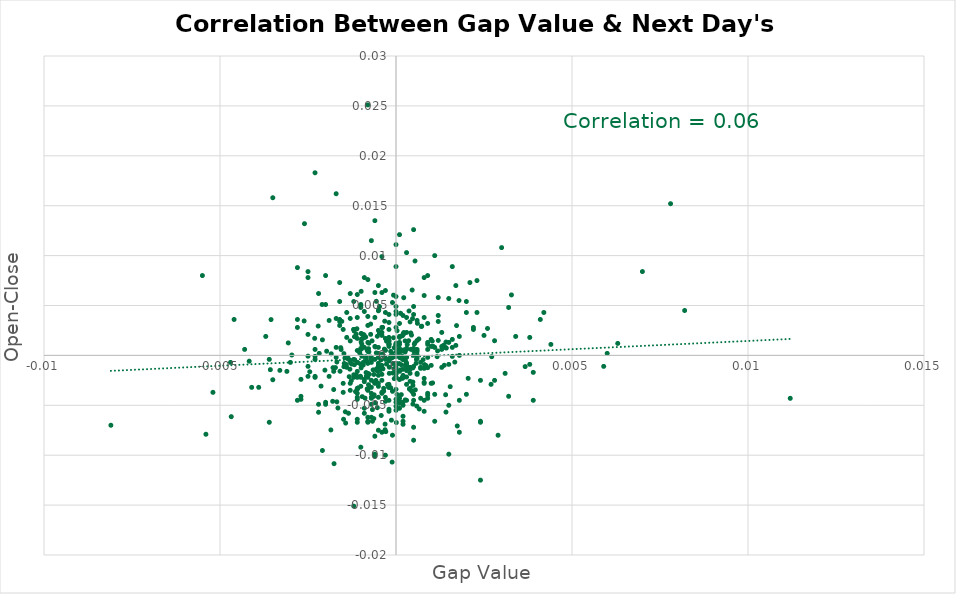
| Category | Series 0 |
|---|---|
| -0.000929999999999986 | -0.001 |
| -0.000110000000000054 | 0 |
| 0.000290000000000012 | -0.001 |
| 0.000439999999999995 | 0.002 |
| -0.00145000000000006 | 0 |
| -0.00143000000000004 | -0.007 |
| 0.000209999999999932 | 0.002 |
| -0.000769999999999937 | 0.001 |
| -0.00148000000000003 | -0.001 |
| 0.0 | -0.002 |
| 0.000219999999999998 | 0.006 |
| -0.00102000000000002 | 0.001 |
| -0.000360000000000027 | 0 |
| 0.000720000000000053 | 0.003 |
| 0.000589999999999979 | -0.005 |
| 0.000260000000000038 | -0.001 |
| -8.99999999999234e-05 | -0.002 |
| 0.000900000000000011 | -0.001 |
| 0.00141000000000002 | -0.004 |
| -0.00118000000000007 | 0.002 |
| 0.000219999999999998 | 0.002 |
| 0.000149999999999983 | -0.004 |
| -0.000580000000000024 | -0.005 |
| -0.00165000000000004 | -0.005 |
| -0.000700000000000033 | 0 |
| -0.000630000000000019 | -0.004 |
| -0.000929999999999986 | -0.001 |
| -0.00202000000000002 | -0.001 |
| 0.000170000000000003 | -0.002 |
| 0.000369999999999981 | 0.004 |
| 0.000380000000000047 | -0.003 |
| -0.000400000000000067 | -0.004 |
| -0.00132999999999994 | -0.002 |
| -0.00177000000000004 | -0.003 |
| -0.00156 | 0.001 |
| -0.000900000000000011 | -0.003 |
| 0.000730000000000008 | 0.003 |
| -0.000989999999999935 | 0.006 |
| 0.000360000000000027 | 0.001 |
| -0.000149999999999983 | 0 |
| -0.00306000000000006 | 0.001 |
| 0.00102999999999997 | 0.001 |
| -0.000209999999999932 | 0 |
| -0.000189999999999912 | 0.001 |
| -0.000390000000000001 | 0 |
| -0.000669999999999948 | -0.007 |
| 0.00153999999999998 | -0.003 |
| -0.000780000000000002 | -0.003 |
| -0.000269999999999992 | 0.001 |
| -0.000199999999999978 | -0.001 |
| -0.00197000000000002 | 0 |
| -8.99999999999234e-05 | -0.001 |
| -0.000419999999999975 | -0.001 |
| 0.000539999999999984 | 0.009 |
| -0.000879999999999991 | -0.004 |
| -0.000470000000000081 | 0.002 |
| -0.00109000000000003 | -0.001 |
| -0.00148000000000003 | 0 |
| -0.000190000000000023 | -0.002 |
| 0.000519999999999964 | 0.001 |
| -0.000209999999999932 | 0.001 |
| -0.00143999999999999 | -0.006 |
| -0.000609999999999999 | -0.003 |
| -0.000380000000000047 | 0.003 |
| -0.00114999999999998 | -0.004 |
| -0.00177000000000004 | -0.002 |
| -0.00209000000000003 | -0.01 |
| -0.00107999999999997 | -0.003 |
| -0.000419999999999975 | -0.006 |
| -0.00175999999999998 | -0.011 |
| -0.000499999999999944 | -0.001 |
| -0.000110000000000054 | -0.011 |
| -6.99999999999034e-05 | 0.006 |
| -0.000969999999999915 | 0 |
| -0.00168000000000001 | -0.005 |
| 0.000580000000000024 | 0 |
| 0.000400000000000067 | -0.001 |
| 0.00141999999999997 | -0.006 |
| -0.00129999999999996 | 0.001 |
| -0.00244999999999995 | -0.002 |
| 0.00327999999999995 | 0.006 |
| -0.00357000000000007 | -0.001 |
| -0.00468000000000001 | -0.006 |
| -0.00350000000000005 | -0.002 |
| 0.00109999999999999 | 0.001 |
| 0.000180000000000069 | 0.002 |
| 0.000499999999999944 | 0 |
| -0.00261 | 0.003 |
| -7.00000000000145e-05 | 0 |
| 0.000219999999999998 | 0.001 |
| -0.00055000000000005 | -0.001 |
| -0.000820000000000042 | -0.003 |
| -0.000620000000000064 | -0.004 |
| 0.00118000000000007 | 0 |
| -0.00097999999999998 | 0.001 |
| 0.00174000000000007 | -0.007 |
| 0.000569999999999959 | -0.001 |
| 9.99999999995449e-06 | 0 |
| 0.000480000000000036 | -0.003 |
| 0.000609999999999999 | 0.003 |
| 0.000260000000000038 | 0 |
| -0.000569999999999959 | -0.003 |
| -0.000720000000000053 | 0.003 |
| -0.00097999999999998 | 0.002 |
| -0.00095999999999996 | 0.002 |
| 0.000480000000000036 | -0.003 |
| -0.000909999999999966 | 0.002 |
| -0.00131000000000003 | -0.001 |
| -0.00117999999999995 | -0.001 |
| -0.00126000000000003 | -0.001 |
| -7.00000000000145e-05 | 0.002 |
| 0.000199999999999978 | 0.002 |
| -0.00141000000000002 | -0.001 |
| -0.000320000000000098 | 0 |
| -0.000149999999999983 | 0 |
| -4.99999999999944e-05 | -0.002 |
| 0.000170000000000003 | 0 |
| 0.000129999999999963 | 0.004 |
| -0.000350000000000072 | -0.003 |
| 0.0001000000000001 | 0 |
| -0.00046999999999997 | 0.005 |
| -0.000130000000000074 | -0.006 |
| -4.99999999999944e-05 | 0.001 |
| 0.000850000000000017 | -0.001 |
| -0.000990000000000046 | 0.002 |
| -0.00417 | -0.001 |
| -0.000190000000000023 | -0.001 |
| -0.000720000000000053 | 0 |
| -0.000139999999999918 | 0 |
| -0.00053000000000003 | -0.002 |
| 0.00141999999999997 | 0.001 |
| 0.00104000000000004 | -0.003 |
| 0.000259999999999927 | 0 |
| -0.000960000000000071 | -0.004 |
| 0.00272000000000005 | 0 |
| 0.00204999999999999 | -0.002 |
| -0.00059000000000009 | 0.001 |
| -0.000329999999999941 | 0.001 |
| 0.000319999999999987 | 0.001 |
| -0.00168000000000001 | -0.001 |
| 0.000259999999999927 | 0.001 |
| -0.000769999999999937 | 0 |
| 0.000480000000000036 | -0.001 |
| 0.000179999999999958 | 0 |
| 0.00166999999999994 | -0.001 |
| 0.000150000000000094 | -0.001 |
| 0.000770000000000048 | 0 |
| 0.00367000000000006 | -0.001 |
| -0.00171999999999994 | -0.001 |
| -0.00119000000000002 | 0.002 |
| -0.000940000000000051 | 0.002 |
| -0.00212999999999996 | -0.003 |
| -5.99999999999489e-05 | 0 |
| 0.00178999999999995 | 0.005 |
| -0.000669999999999948 | -0.005 |
| 0.000299999999999967 | -0.002 |
| -0.000430000000000041 | 0 |
| -0.00110999999999994 | 0.003 |
| -0.000349999999999961 | -0.004 |
| -0.000560000000000004 | 0 |
| -0.000970000000000026 | 0.001 |
| -0.00100999999999995 | -0.002 |
| -0.000849999999999906 | -0.002 |
| -0.000269999999999992 | -0.001 |
| 9.99999999995449e-06 | 0.001 |
| -0.000149999999999983 | -0.003 |
| -0.00156999999999996 | 0.001 |
| -0.000759999999999982 | -0.002 |
| -0.000840000000000062 | -0.001 |
| 0.000460000000000016 | 0.007 |
| 0.000650000000000039 | 0.002 |
| -0.00117 | 0 |
| -0.00129000000000001 | -0.001 |
| -0.00135000000000007 | -0.006 |
| 9.99999999999889e-05 | -0.002 |
| -0.000239999999999907 | -0.003 |
| -0.000499999999999944 | 0.004 |
| 0.000149999999999983 | 0 |
| -0.00048999999999999 | 0.005 |
| -0.000560000000000004 | 0.005 |
| -0.000369999999999981 | -0.001 |
| -0.000689999999999968 | -0.004 |
| -0.000679999999999902 | 0.001 |
| -0.000309999999999921 | -0.007 |
| 0.000189999999999912 | -0.002 |
| 0.00117 | 0 |
| -0.000820000000000042 | 0.001 |
| -5.99999999999489e-05 | -0.001 |
| -0.00184000000000006 | 0 |
| -0.00126999999999999 | -0.003 |
| -0.00231000000000003 | 0.002 |
| -0.00209000000000003 | 0.002 |
| 0.000480000000000036 | -0.005 |
| -0.00148999999999999 | -0.006 |
| -0.00119999999999997 | -0.002 |
| 0.000600000000000044 | 0 |
| -0.000290000000000012 | -0.008 |
| -0.00295999999999996 | 0 |
| 0.000549999999999939 | -0.003 |
| -0.00146999999999997 | -0.001 |
| -0.000859999999999971 | 0.002 |
| 3.00000000000855e-05 | -0.004 |
| -0.00100999999999995 | -0.001 |
| -0.000990000000000046 | -0.001 |
| 7.99999999999689e-05 | 0 |
| -0.00249999999999994 | 0 |
| 0.000539999999999984 | 0.001 |
| -0.00354999999999994 | 0.004 |
| -0.000990000000000046 | 0.001 |
| 7.00000000000145e-05 | 0.001 |
| -0.000650000000000039 | -0.001 |
| 0.000120000000000009 | -0.001 |
| 0.000339999999999895 | -0.001 |
| -0.00112999999999996 | 0.002 |
| -0.00153999999999998 | 0.003 |
| -0.00158999999999998 | -0.002 |
| -0.00109999999999999 | 0 |
| -0.000720000000000053 | 0.002 |
| -0.000859999999999971 | 0 |
| -0.000319999999999987 | 0.003 |
| 9.00000000000345e-05 | -0.001 |
| 0.000419999999999975 | 0.002 |
| -0.00102999999999997 | 0 |
| -0.00178999999999995 | -0.001 |
| -0.00136000000000002 | 0 |
| -0.000309999999999921 | -0.007 |
| 0.000299999999999967 | -0.002 |
| -0.00135999999999991 | 0 |
| -0.00053000000000003 | -0.005 |
| 0.00171999999999994 | 0.003 |
| -0.000840000000000062 | -0.002 |
| -0.000210000000000043 | -0.003 |
| -0.000630000000000019 | -0.002 |
| 0.000190000000000023 | -0.001 |
| 0.00046999999999997 | -0.004 |
| 0.00105999999999995 | 0.001 |
| -0.00220999999999993 | 0.003 |
| 0.000419999999999975 | 0.001 |
| 0.00143000000000004 | 0.001 |
| 2.99999999999744e-05 | 0.002 |
| -0.000460000000000016 | -0.001 |
| 0.000600000000000044 | -0.002 |
| 1.00000000000655e-05 | -0.007 |
| -0.00218000000000007 | 0 |
| 0.000659999999999993 | -0.005 |
| 0.00135000000000007 | 0.001 |
| 0.000809999999999977 | -0.001 |
| 0.000399999999999955 | 0.003 |
| -0.000630000000000019 | -0.006 |
| -0.00112999999999996 | -0.002 |
| 0.00042999999999993 | -0.004 |
| -0.00185000000000001 | -0.007 |
| 0.00280000000000002 | 0.001 |
| 0.00136999999999998 | -0.001 |
| -0.000780000000000002 | 0.001 |
| -0.000529999999999919 | 0.002 |
| 0.000260000000000038 | -0.004 |
| 0.00046999999999997 | 0.004 |
| 0.0 | 0.001 |
| 0.000800000000000022 | -0.003 |
| -0.000700000000000033 | -0.003 |
| -0.000199999999999978 | -0.003 |
| -0.00129999999999996 | -0.003 |
| -0.000800000000000022 | -0.002 |
| -0.00269999999999992 | -0.002 |
| -0.00109999999999999 | -0.002 |
| -9.99999999999889e-05 | 0 |
| -0.000199999999999978 | 0.003 |
| -0.000499999999999944 | 0 |
| 0.00259999999999993 | 0.003 |
| -0.000799999999999911 | 0.008 |
| -0.000699999999999922 | -0.006 |
| -0.00549999999999994 | 0.008 |
| 0.002 | -0.004 |
| 0.000199999999999978 | 0 |
| -0.000400000000000067 | 0.003 |
| -0.000299999999999967 | 0 |
| 9.99999999999889e-05 | 0 |
| -0.000399999999999955 | -0.002 |
| -0.00109999999999999 | 0.006 |
| -0.000199999999999978 | -0.004 |
| -0.000500000000000056 | -0.001 |
| -0.00359999999999993 | -0.007 |
| 0.000199999999999978 | -0.005 |
| -0.00160000000000004 | 0.005 |
| -0.000700000000000033 | -0.004 |
| -0.000900000000000011 | 0.002 |
| -0.00129999999999996 | 0.006 |
| -0.00329999999999997 | -0.002 |
| -0.00469999999999992 | -0.001 |
| 0.00149999999999994 | -0.005 |
| -0.00129999999999996 | -0.003 |
| -0.000699999999999922 | -0.001 |
| 0.000800000000000022 | -0.006 |
| 0.000499999999999944 | 0.004 |
| -0.00519999999999998 | -0.004 |
| 0.00159999999999993 | 0 |
| -0.00250000000000005 | 0.008 |
| 0.000299999999999967 | -0.001 |
| -9.99999999999889e-05 | -0.004 |
| -0.000299999999999967 | -0.004 |
| -0.000399999999999955 | 0.01 |
| 9.99999999999889e-05 | -0.005 |
| -0.000199999999999978 | 0.004 |
| 0.000500000000000056 | 0.005 |
| 0.0 | -0.001 |
| -0.00359999999999993 | 0 |
| -0.000500000000000056 | -0.003 |
| -0.000799999999999911 | 0.001 |
| -0.00149999999999994 | -0.004 |
| 0.000900000000000011 | -0.004 |
| -0.00170000000000003 | 0.004 |
| -0.000900000000000011 | 0.008 |
| -0.000399999999999955 | -0.002 |
| 0.002 | 0.004 |
| 0.000499999999999944 | 0.013 |
| -0.00229999999999996 | 0.018 |
| 0.000400000000000067 | -0.003 |
| -0.000700000000000033 | 0 |
| 0.000800000000000022 | 0.004 |
| -0.000799999999999911 | -0.003 |
| 0.0 | -0.004 |
| -0.00169999999999992 | 0.001 |
| -0.00229999999999996 | -0.002 |
| -0.000799999999999911 | -0.002 |
| -0.000799999999999911 | 0.004 |
| 0.000299999999999967 | -0.001 |
| -0.000299999999999967 | -0.01 |
| -0.00229999999999996 | 0 |
| 0.0 | -0.001 |
| -0.00219999999999998 | 0.006 |
| -0.00260000000000004 | 0.013 |
| -0.00109999999999999 | -0.001 |
| 0.0 | -0.005 |
| 0.00229999999999996 | 0.004 |
| -0.000500000000000056 | 0.007 |
| 0.0 | 0.005 |
| -0.00120000000000009 | 0.005 |
| 0.00240000000000006 | -0.007 |
| -0.00109999999999999 | -0.004 |
| 0.001 | 0.002 |
| -0.001 | 0.005 |
| 0.000500000000000056 | 0.001 |
| 0.00309999999999999 | -0.002 |
| -0.000900000000000011 | -0.006 |
| 9.99999999999889e-05 | -0.004 |
| -0.00229999999999996 | 0.001 |
| -0.000299999999999967 | 0.001 |
| 0.00170000000000003 | 0.007 |
| -0.00229999999999996 | 0 |
| -0.000800000000000022 | -0.003 |
| -0.000199999999999978 | 0.001 |
| 9.99999999999889e-05 | 0.003 |
| -0.001 | 0.005 |
| -0.002 | -0.005 |
| -0.000399999999999955 | 0.002 |
| 0.0041000000000001 | 0.004 |
| 0.00219999999999998 | 0.003 |
| -0.00209999999999999 | 0.005 |
| -0.000399999999999955 | -0.004 |
| 0.000700000000000033 | -0.004 |
| 0.000500000000000056 | -0.007 |
| -0.000500000000000056 | -0.008 |
| 0.000299999999999967 | 0.01 |
| 0.00219999999999998 | 0.003 |
| 0.000399999999999955 | -0.003 |
| -0.00190000000000001 | 0.003 |
| -0.000700000000000033 | -0.003 |
| -0.001 | 0.005 |
| 0.0 | 0.001 |
| 0.000900000000000011 | 0.001 |
| -0.000500000000000056 | -0.002 |
| 9.99999999999889e-05 | 0.001 |
| 0.00159999999999993 | 0.002 |
| -0.000199999999999978 | 0.001 |
| 0.000700000000000033 | -0.001 |
| 0.000299999999999967 | 0.002 |
| 0.000299999999999967 | -0.001 |
| -0.000400000000000067 | -0.001 |
| 0.000299999999999967 | 0.001 |
| -0.000600000000000044 | 0.004 |
| -0.000800000000000022 | -0.001 |
| 0.000900000000000011 | 0.001 |
| 0.001 | 0.001 |
| 0.000500000000000056 | -0.001 |
| 0.0 | 0.004 |
| -0.001 | 0.001 |
| 0.0 | 0 |
| -0.00190000000000001 | -0.002 |
| 0.001 | -0.001 |
| 0.000599999999999933 | 0 |
| 0.000300000000000078 | -0.003 |
| 0.000499999999999944 | 0 |
| -0.00249999999999994 | -0.001 |
| 0.000300000000000078 | -0.004 |
| -0.000499999999999944 | 0 |
| -0.00109999999999999 | 0.002 |
| 0.00180000000000002 | 0.002 |
| 0.000199999999999978 | 0 |
| -0.000799999999999911 | -0.007 |
| -0.000599999999999933 | -0.008 |
| 0.0 | -0.002 |
| 0.000900000000000011 | -0.004 |
| 0.00170000000000003 | 0.001 |
| 9.99999999999889e-05 | 0.001 |
| 0.000600000000000044 | 0.001 |
| 0.00270000000000003 | -0.003 |
| -0.00109999999999999 | -0.003 |
| 0.00340000000000007 | 0.002 |
| 0.00159999999999993 | 0.001 |
| -0.001 | -0.003 |
| 0.000700000000000033 | -0.001 |
| -0.00160000000000004 | 0.003 |
| -0.000700000000000033 | -0.005 |
| 9.99999999999889e-05 | 0.001 |
| -0.000499999999999944 | -0.003 |
| -0.001 | -0.002 |
| 0.00819999999999998 | 0.005 |
| 0.000800000000000022 | -0.001 |
| 0.00390000000000001 | -0.004 |
| 0.000900000000000011 | -0.004 |
| 0.000600000000000044 | 0.004 |
| -0.000299999999999967 | 0.002 |
| -0.00809999999999999 | -0.007 |
| -0.000299999999999967 | 0.004 |
| 0.00239999999999995 | -0.007 |
| 0.00390000000000001 | -0.002 |
| -0.000599999999999933 | -0.01 |
| -0.000600000000000044 | -0.01 |
| 0.000400000000000067 | -0.001 |
| 0.00120000000000009 | 0.006 |
| -0.00539999999999996 | -0.008 |
| 0.00240000000000006 | -0.012 |
| 0.00250000000000005 | 0.002 |
| 0.00290000000000001 | -0.008 |
| 0.000199999999999978 | 0.004 |
| -0.000900000000000011 | 0.001 |
| 0.000499999999999944 | -0.009 |
| -0.00119999999999997 | -0.002 |
| -0.00170000000000003 | 0.016 |
| -0.00219999999999998 | -0.005 |
| -0.000500000000000056 | -0.001 |
| -0.000800000000000022 | -0.001 |
| -0.0038999999999999 | -0.003 |
| -0.00109999999999999 | -0.006 |
| -0.00180000000000002 | -0.005 |
| -0.00159999999999993 | 0.003 |
| -0.000799999999999911 | -0.001 |
| 0.00150000000000005 | 0.001 |
| 0.00319999999999998 | 0.005 |
| -0.00139999999999995 | 0.002 |
| 9.99999999999889e-05 | 0.001 |
| 0.00319999999999998 | -0.004 |
| 0.000199999999999978 | -0.007 |
| 0.000199999999999978 | -0.007 |
| 0.00119999999999997 | 0.001 |
| 0.0 | 0.001 |
| 0.000199999999999978 | -0.002 |
| 0.000299999999999967 | 0 |
| -0.000200000000000089 | 0.001 |
| 0.00109999999999999 | -0.007 |
| 0.000799999999999911 | -0.002 |
| -0.000900000000000011 | -0.002 |
| -0.000199999999999978 | 0.003 |
| -0.000199999999999978 | -0.003 |
| 0.00129999999999996 | 0.001 |
| -0.00109999999999999 | -0.004 |
| -0.000800000000000022 | 0 |
| 0.000900000000000011 | 0.008 |
| 0.000900000000000011 | 0.003 |
| -0.00150000000000005 | 0.003 |
| -0.00279999999999991 | 0.003 |
| 0.00119999999999997 | 0.003 |
| 0.000400000000000067 | -0.002 |
| -0.00119999999999997 | 0.003 |
| 0.0 | -0.001 |
| 0.0008999999999999 | 0.001 |
| -0.002 | 0.008 |
| 0.00140000000000006 | 0.001 |
| -0.000499999999999944 | 0.001 |
| -0.000599999999999933 | -0.003 |
| -0.000399999999999955 | 0.002 |
| 0.00380000000000002 | -0.001 |
| 0.007 | 0.008 |
| -0.000800000000000022 | -0.006 |
| 0.006 | 0 |
| 0.00149999999999994 | -0.01 |
| -9.99999999999889e-05 | 0.005 |
| -0.00270000000000003 | -0.004 |
| 0.000299999999999967 | 0.004 |
| -0.00139999999999995 | 0.004 |
| 0.002 | 0.005 |
| -0.00270000000000003 | -0.004 |
| 0.00590000000000001 | -0.001 |
| -0.0008999999999999 | -0.005 |
| 0.000299999999999967 | -0.001 |
| -0.00309999999999999 | -0.002 |
| 0.00160000000000004 | 0.009 |
| 0.000500000000000056 | -0.004 |
| 0.00629999999999997 | 0.001 |
| 0.00279999999999991 | -0.003 |
| 9.99999999999889e-05 | 0.002 |
| -0.00130000000000007 | 0.004 |
| 0.000799999999999911 | -0.005 |
| -0.00249999999999994 | -0.002 |
| -0.001 | -0.009 |
| -0.000700000000000033 | -0.004 |
| -0.00229999999999996 | -0.002 |
| 0.00209999999999999 | 0.007 |
| -0.000600000000000044 | 0.013 |
| 0.00440000000000007 | 0.001 |
| 0.0111999999999999 | -0.004 |
| -0.000599999999999933 | 0.006 |
| 0.00779999999999991 | 0.015 |
| 0.00380000000000002 | 0.002 |
| -0.000700000000000033 | 0.011 |
| -0.00109999999999999 | -0.003 |
| -0.00280000000000002 | 0.009 |
| -0.00120000000000009 | -0.015 |
| 0.00109999999999999 | 0.01 |
| 0.000800000000000022 | -0.003 |
| -0.00460000000000004 | 0.004 |
| -0.000600000000000044 | 0 |
| -0.00350000000000005 | 0.016 |
| 0.00180000000000002 | -0.008 |
| 0.00109999999999999 | -0.004 |
| 0.000700000000000033 | -0.001 |
| -0.000799999999999911 | 0.025 |
| 0.00119999999999997 | 0.004 |
| -0.000599999999999933 | 0.001 |
| 0.00130000000000007 | 0.001 |
| -0.00250000000000005 | 0.008 |
| 0.000500000000000056 | -0.004 |
| -0.00160000000000004 | 0.004 |
| -0.003 | -0.001 |
| -0.000800000000000022 | 0.003 |
| -0.000800000000000022 | -0.001 |
| -0.00109999999999999 | -0.002 |
| -0.00280000000000002 | 0.004 |
| -0.002 | 0.005 |
| 0.00130000000000007 | -0.001 |
| -0.000900000000000011 | 0.004 |
| -0.000200000000000089 | 0.002 |
| 9.99999999999889e-05 | 0.012 |
| 0.000299999999999967 | 0.001 |
| 0.000600000000000044 | 0 |
| -0.000500000000000056 | 0.002 |
| 9.99999999999889e-05 | -0.005 |
| -0.00120000000000009 | 0.003 |
| -0.00119999999999997 | 0 |
| -0.00149999999999994 | -0.003 |
| 0.000900000000000011 | 0 |
| -0.00429999999999997 | 0.001 |
| -0.0011000000000001 | -0.004 |
| -0.00409999999999999 | -0.003 |
| -0.000800000000000022 | -0.007 |
| 0.00179999999999991 | -0.005 |
| -0.00220000000000009 | -0.006 |
| -0.00370000000000003 | 0.002 |
| -0.002 | -0.005 |
| 0.000199999999999978 | -0.005 |
| -0.000199999999999978 | -0.005 |
| -0.00250000000000005 | 0.002 |
| 0.00229999999999996 | 0.008 |
| 0.000799999999999911 | 0.008 |
| 0.00419999999999998 | 0.004 |
| -0.00159999999999993 | 0.007 |
| -0.000499999999999944 | -0.001 |
| 0.00239999999999995 | -0.002 |
| -0.000499999999999944 | -0.001 |
| 0.000800000000000022 | 0.006 |
| 0.00149999999999994 | 0.006 |
| 0.00129999999999996 | 0.002 |
| 0.001 | -0.003 |
| 0.00180000000000002 | 0 |
| -0.00280000000000002 | -0.005 |
| 0.003 | 0.011 |
| -0.00170000000000003 | 0 |
| 0.000600000000000044 | 0.002 |
| -0.00109999999999999 | 0.004 |
| -0.000400000000000067 | -0.008 |
| -0.00109999999999999 | -0.007 |
| 0.0 | 0.004 |
| 0.000600000000000044 | -0.002 |
| 0.0 | 0.003 |
| -0.000299999999999967 | 0.006 |
| 0.0 | -0.002 |
| 0.0 | -0.006 |
| 0.0 | 0.011 |
| 0.0 | -0.001 |
| 0.0 | 0.006 |
| 0.0 | 0.009 |
| 9.99999999999889e-05 | -0.005 |
| -0.000500000000000056 | -0.004 |
| -0.000199999999999978 | -0.006 |
| 9.99999999999889e-05 | -0.002 |
| 0.0001000000000001 | 0.002 |
| 0.0 | 0.001 |
| 0.000200000000000089 | -0.006 |
| -0.00129999999999996 | -0.001 |
| 0.0 | -0.002 |
| -0.000700000000000033 | -0.004 |
| 0.0 | -0.002 |
| 0.00149999999999994 | -0.001 |
| -0.00139999999999995 | -0.001 |
| -0.000400000000000067 | 0.006 |
| -9.99999999999889e-05 | -0.008 |
| -0.000299999999999967 | -0.005 |
| 0.0 | -0.003 |
| 0.0 | -0.005 |